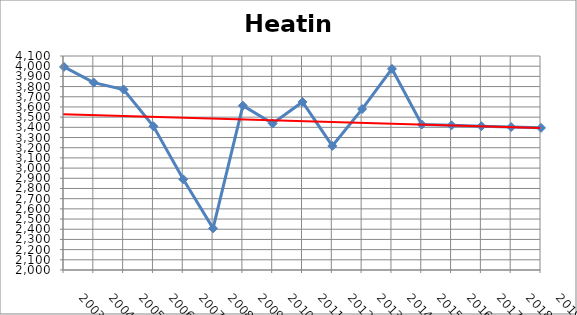
| Category | Heating |
|---|---|
| 2003.0 | 3992.8 |
| 2004.0 | 3838.7 |
| 2005.0 | 3770.7 |
| 2006.0 | 3410.2 |
| 2007.0 | 2890.1 |
| 2008.0 | 2408.7 |
| 2009.0 | 3612.7 |
| 2010.0 | 3437.7 |
| 2011.0 | 3649.1 |
| 2012.0 | 3217.4 |
| 2013.0 | 3579.1 |
| 2014.0 | 3973.9 |
| 2015.0 | 3427.756 |
| 2016.0 | 3419.448 |
| 2017.0 | 3411.14 |
| 2018.0 | 3402.832 |
| 2019.0 | 3394.524 |